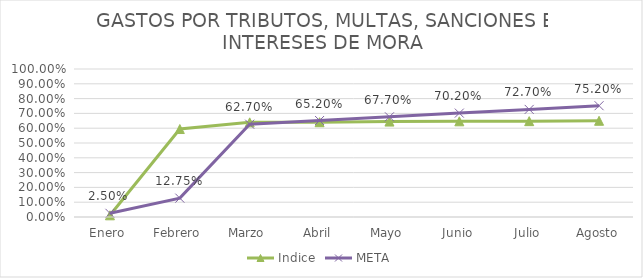
| Category | Indice | META |
|---|---|---|
| Enero | 0.011 | 0.025 |
| Febrero | 0.594 | 0.128 |
| Marzo | 0.64 | 0.627 |
| Abril | 0.64 | 0.652 |
| Mayo | 0.645 | 0.677 |
| Junio | 0.647 | 0.702 |
| Julio | 0.648 | 0.727 |
| Agosto | 0.65 | 0.752 |